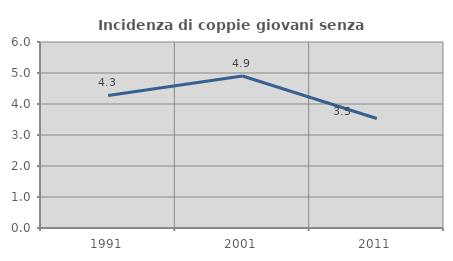
| Category | Incidenza di coppie giovani senza figli |
|---|---|
| 1991.0 | 4.276 |
| 2001.0 | 4.903 |
| 2011.0 | 3.532 |